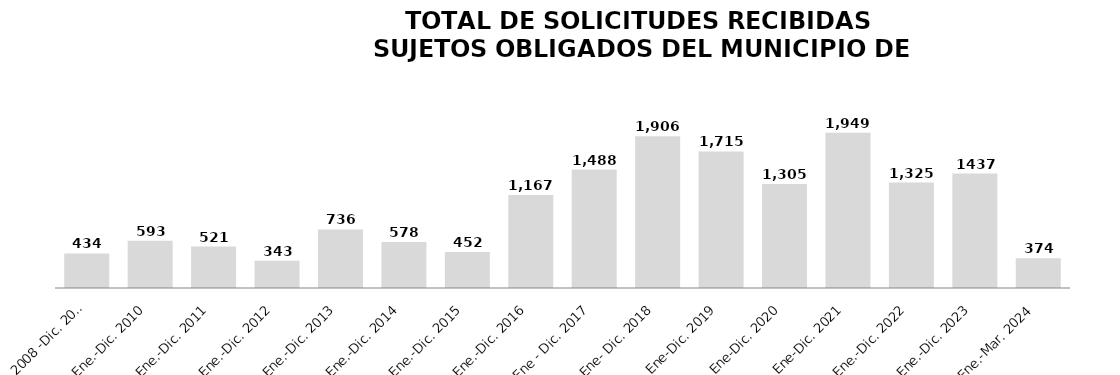
| Category | Series 0 |
|---|---|
| Nov. 2008 -Dic. 2009 | 434 |
| Ene.-Dic. 2010 | 593 |
| Ene.-Dic. 2011 | 521 |
| Ene.-Dic. 2012 | 343 |
| Ene.-Dic. 2013 | 736 |
| Ene.-Dic. 2014 | 578 |
| Ene.-Dic. 2015 | 452 |
| Ene.-Dic. 2016 | 1167 |
| Ene - Dic. 2017 | 1488 |
| Ene- Dic. 2018 | 1906 |
| Ene-Dic. 2019 | 1715 |
| Ene-Dic. 2020 | 1305 |
| Ene-Dic. 2021 | 1949 |
| Ene.-Dic. 2022 | 1325 |
| Ene.-Dic. 2023 | 1437 |
| Ene.-Mar. 2024 | 374 |